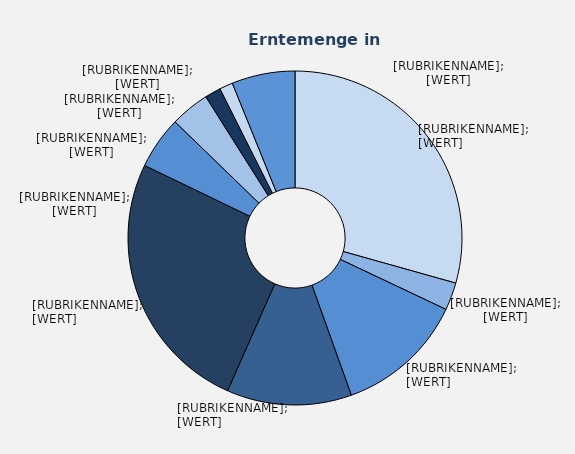
| Category | Series 1 |
|---|---|
| Elstar | 143174 |
| Jonagold | 13051 |
| Jonagored | 60935 |
| Braeburn | 58971 |
| Jonaprince | 124566 |
| Boskoop | 24836 |
| Holsteiner Cox | 18493 |
| Topaz | 7546 |
| Wellant | 6311 |
| Sonstige | 29850 |